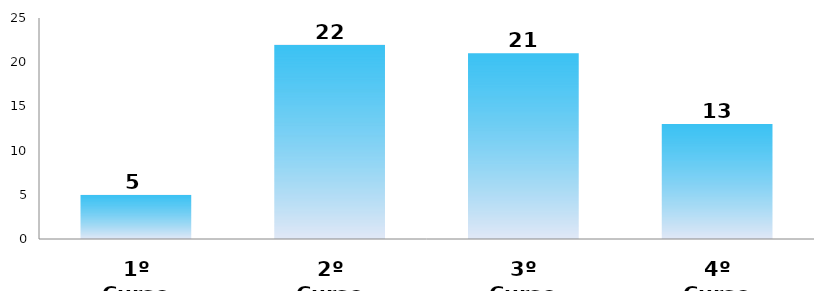
| Category | Series 0 |
|---|---|
| 1º Curso | 5 |
| 2º Curso | 22 |
| 3º Curso | 21 |
| 4º Curso | 13 |